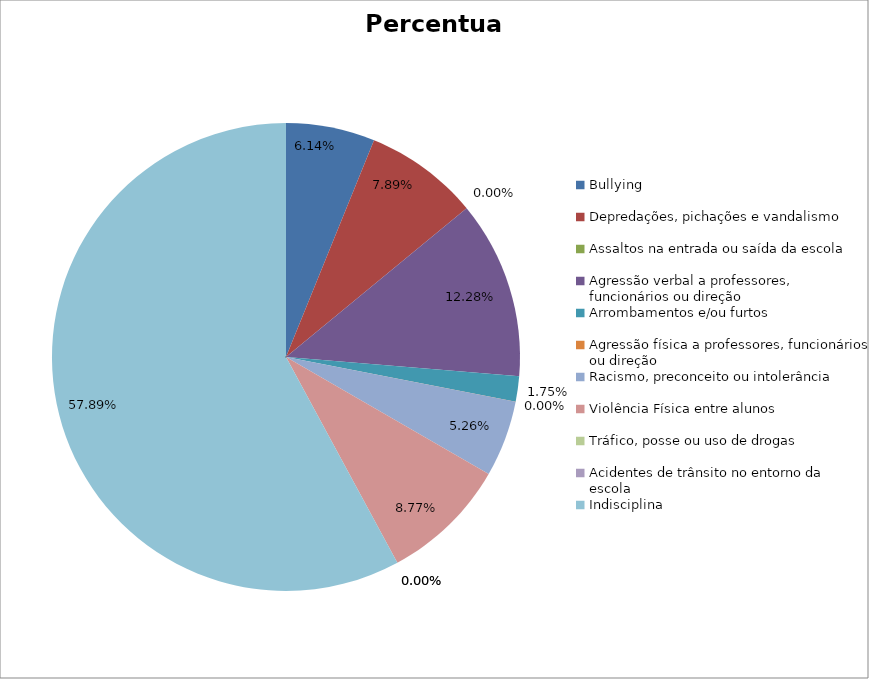
| Category | Percentual |
|---|---|
| Bullying | 0.061 |
| Depredações, pichações e vandalismo | 0.079 |
| Assaltos na entrada ou saída da escola | 0 |
| Agressão verbal a professores, funcionários ou direção | 0.123 |
| Arrombamentos e/ou furtos | 0.018 |
| Agressão física a professores, funcionários ou direção | 0 |
| Racismo, preconceito ou intolerância | 0.053 |
| Violência Física entre alunos | 0.088 |
| Tráfico, posse ou uso de drogas | 0 |
| Acidentes de trânsito no entorno da escola | 0 |
| Indisciplina | 0.579 |